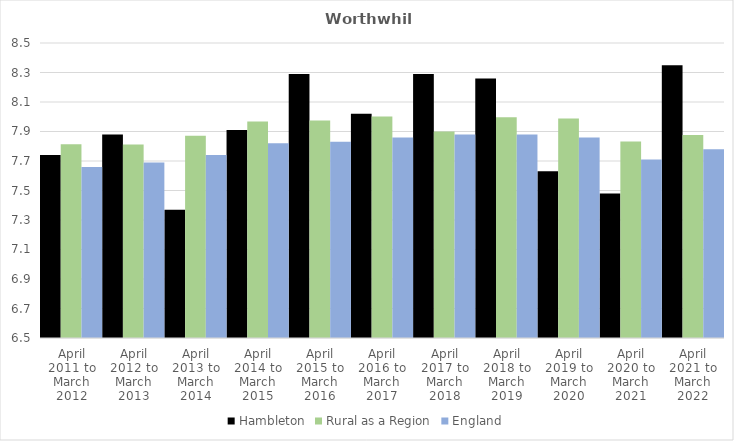
| Category | Hambleton | Rural as a Region | England |
|---|---|---|---|
| April 2011 to March 2012 | 7.74 | 7.813 | 7.66 |
| April 2012 to March 2013 | 7.88 | 7.811 | 7.69 |
| April 2013 to March 2014 | 7.37 | 7.871 | 7.74 |
| April 2014 to March 2015 | 7.91 | 7.967 | 7.82 |
| April 2015 to March 2016 | 8.29 | 7.975 | 7.83 |
| April 2016 to March 2017 | 8.02 | 8.002 | 7.86 |
| April 2017 to March 2018 | 8.29 | 7.9 | 7.88 |
| April 2018 to March 2019 | 8.26 | 7.996 | 7.88 |
| April 2019 to March 2020 | 7.63 | 7.988 | 7.86 |
| April 2020 to March 2021 | 7.48 | 7.831 | 7.71 |
| April 2021 to March 2022 | 8.35 | 7.877 | 7.78 |